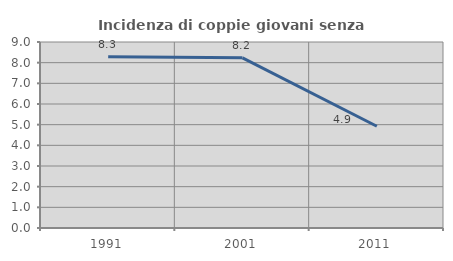
| Category | Incidenza di coppie giovani senza figli |
|---|---|
| 1991.0 | 8.283 |
| 2001.0 | 8.235 |
| 2011.0 | 4.924 |